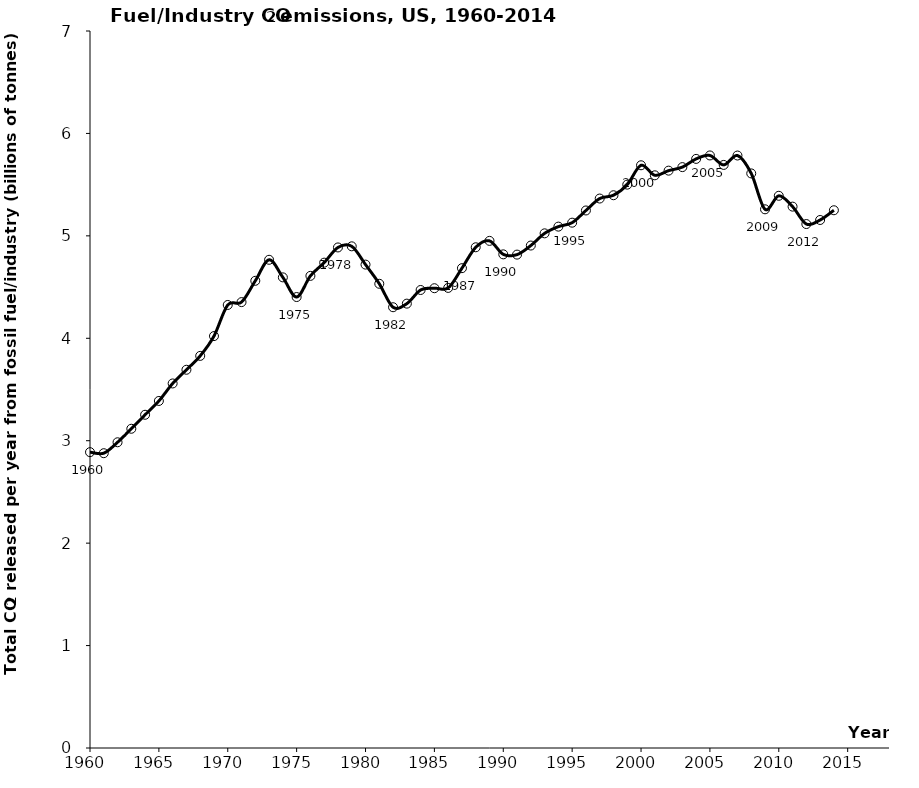
| Category | Series 0 |
|---|---|
| 1960.0 | 2.888 |
| 1961.0 | 2.878 |
| 1962.0 | 2.985 |
| 1963.0 | 3.117 |
| 1964.0 | 3.253 |
| 1965.0 | 3.388 |
| 1966.0 | 3.559 |
| 1967.0 | 3.693 |
| 1968.0 | 3.828 |
| 1969.0 | 4.021 |
| 1970.0 | 4.325 |
| 1971.0 | 4.353 |
| 1972.0 | 4.561 |
| 1973.0 | 4.766 |
| 1974.0 | 4.595 |
| 1975.0 | 4.403 |
| 1976.0 | 4.609 |
| 1977.0 | 4.738 |
| 1978.0 | 4.887 |
| 1979.0 | 4.898 |
| 1980.0 | 4.719 |
| 1981.0 | 4.532 |
| 1982.0 | 4.303 |
| 1983.0 | 4.338 |
| 1984.0 | 4.472 |
| 1985.0 | 4.489 |
| 1986.0 | 4.492 |
| 1987.0 | 4.685 |
| 1988.0 | 4.889 |
| 1989.0 | 4.951 |
| 1990.0 | 4.819 |
| 1991.0 | 4.817 |
| 1992.0 | 4.906 |
| 1993.0 | 5.025 |
| 1994.0 | 5.09 |
| 1995.0 | 5.129 |
| 1996.0 | 5.248 |
| 1997.0 | 5.364 |
| 1998.0 | 5.397 |
| 1999.0 | 5.5 |
| 2000.0 | 5.689 |
| 2001.0 | 5.591 |
| 2002.0 | 5.637 |
| 2003.0 | 5.671 |
| 2004.0 | 5.751 |
| 2005.0 | 5.785 |
| 2006.0 | 5.693 |
| 2007.0 | 5.784 |
| 2008.0 | 5.61 |
| 2009.0 | 5.259 |
| 2010.0 | 5.391 |
| 2011.0 | 5.285 |
| 2012.0 | 5.115 |
| 2013.0 | 5.155 |
| 2014.0 | 5.25 |